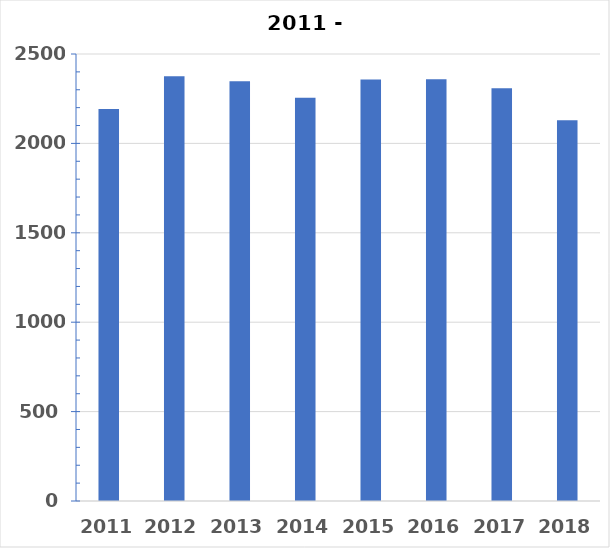
| Category | Series 0 |
|---|---|
| 2011  | 2192 |
| 2012 | 2375 |
| 2013 | 2348 |
| 2014  | 2255 |
| 2015   | 2358 |
| 2016   | 2359 |
| 2017   | 2308 |
| 2018   | 2129 |